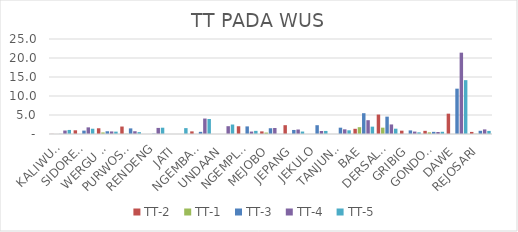
| Category | TT-2 | TT-1 | TT-3 | TT-4 | TT-5 |
|---|---|---|---|---|---|
| KALIWUNGU | 0.032 | 0.008 | 0.032 | 0.917 | 1.067 |
| SIDOREKSO | 0.975 | 0 | 0.893 | 1.745 | 1.387 |
| WERGU WETAN | 1.508 | 0.411 | 0.723 | 0.673 | 0.623 |
| PURWOSARI | 1.966 | 0.063 | 1.477 | 0.726 | 0.488 |
| RENDENG | 0 | 0 | 0.097 | 1.6 | 1.655 |
| JATI | 0 | 0 | 0 | 0 | 1.548 |
| NGEMBAL KULON | 0.689 | 0 | 0.568 | 4.068 | 3.947 |
| UNDAAN | 0 | 0 | 0 | 2.053 | 2.493 |
| NGEMPLAK | 2.037 | 0 | 2 | 0.637 | 0.825 |
| MEJOBO | 0.688 | 0.382 | 1.518 | 1.583 | 0 |
| JEPANG | 2.319 | 0 | 1.062 | 1.184 | 0.647 |
| JEKULO | 0 | 0 | 2.314 | 0.785 | 0.805 |
| TANJUNGREJO | 0 | 0 | 1.663 | 1.231 | 0.972 |
| BAE | 1.368 | 1.792 | 5.472 | 3.632 | 1.934 |
| DERSALAM | 5.118 | 1.666 | 4.568 | 2.515 | 1.399 |
| GRIBIG | 0.877 | 0 | 0.946 | 0.637 | 0.439 |
| GONDOSARI | 0.834 | 0.432 | 0.566 | 0.525 | 0.587 |
| DAWE | 5.351 | 0 | 11.931 | 21.403 | 14.172 |
| REJOSARI | 0.548 | 0.062 | 0.847 | 1.208 | 0.81 |